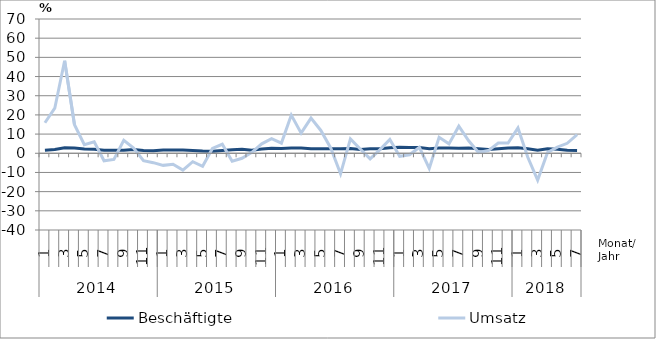
| Category | Beschäftigte | Umsatz |
|---|---|---|
| 0 | 1.6 | 15.9 |
| 1 | 2 | 23.5 |
| 2 | 2.9 | 48.2 |
| 3 | 2.8 | 14.9 |
| 4 | 2.2 | 4.5 |
| 5 | 2.1 | 6 |
| 6 | 1.6 | -3.9 |
| 7 | 1.6 | -3.2 |
| 8 | 1.6 | 6.8 |
| 9 | 2 | 2.7 |
| 10 | 1.4 | -3.9 |
| 11 | 1.3 | -4.9 |
| 12 | 1.7 | -6.3 |
| 13 | 1.7 | -5.7 |
| 14 | 1.7 | -8.8 |
| 15 | 1.5 | -4.4 |
| 16 | 1.2 | -6.8 |
| 17 | 1.1 | 2.5 |
| 18 | 1.5 | 4.7 |
| 19 | 1.8 | -4.1 |
| 20 | 2.1 | -2.6 |
| 21 | 1.6 | 0.5 |
| 22 | 2.2 | 4.9 |
| 23 | 2.6 | 7.6 |
| 24 | 2.5 | 5.3 |
| 25 | 2.7 | 19.9 |
| 26 | 2.8 | 10.5 |
| 27 | 2.4 | 18.3 |
| 28 | 2.4 | 11.9 |
| 29 | 2.4 | 2.8 |
| 30 | 2.3 | -10.7 |
| 31 | 2.5 | 7.5 |
| 32 | 2 | 2.2 |
| 33 | 2.4 | -2.9 |
| 34 | 2.3 | 1.9 |
| 35 | 2.9 | 7.2 |
| 36 | 3.1 | -1.6 |
| 37 | 3 | -0.8 |
| 38 | 3 | 3.1 |
| 39 | 2.4 | -7.9 |
| 40 | 2.8 | 8.3 |
| 41 | 2.7 | 4.9 |
| 42 | 2.6 | 14.1 |
| 43 | 2.7 | 6.5 |
| 44 | 2.3 | 0.4 |
| 45 | 2 | 1.4 |
| 46 | 2.4 | 5.3 |
| 47 | 2.8 | 5.3 |
| 48 | 2.9 | 13.2 |
| 49 | 2.3 | -2.1 |
| 50 | 1.6 | -14 |
| 51 | 2.4 | 0.4 |
| 52 | 2.1 | 3.2 |
| 53 | 1.6 | 5.2 |
| 54 | 1.5 | 9.7 |